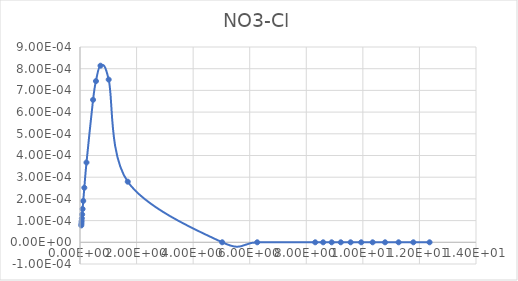
| Category | Series 0 |
|---|---|
| 0.045799 | 0 |
| 0.050887 | 0 |
| 0.057261 | 0 |
| 0.065458 | 0 |
| 0.076373 | 0 |
| 0.091688 | 0 |
| 0.11464 | 0 |
| 0.15299 | 0 |
| 0.22973 | 0 |
| 0.46172 | 0.001 |
| 0.56419 | 0.001 |
| 0.72511 | 0.001 |
| 1.0144 | 0.001 |
| 1.688 | 0 |
| 5.0263 | 0 |
| 6.2654 | 0 |
| 8.3152 | 0 |
| 8.5965 | 0 |
| 8.8974 | 0 |
| 9.2202 | 0 |
| 9.5673 | 0 |
| 9.9415 | 0 |
| 10.346 | 0 |
| 10.785 | 0 |
| 11.263 | 0 |
| 11.785 | 0 |
| 12.358 | 0 |